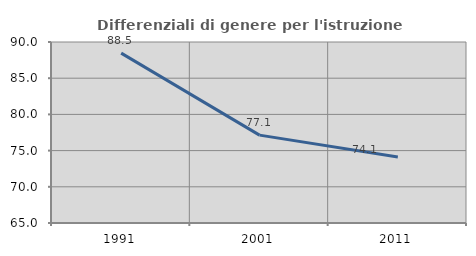
| Category | Differenziali di genere per l'istruzione superiore |
|---|---|
| 1991.0 | 88.458 |
| 2001.0 | 77.135 |
| 2011.0 | 74.116 |